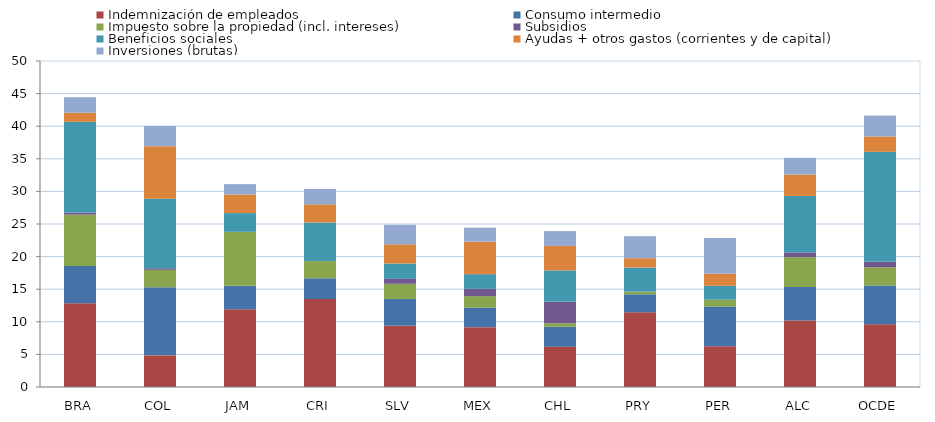
| Category | Indemnización de empleados | Consumo intermedio | Impuesto sobre la propiedad (incl. intereses) | Subsidios | Beneficios sociales | Ayudas + otros gastos (corrientes y de capital) | Inversiones (brutas) |
|---|---|---|---|---|---|---|---|
| BRA | 12.853 | 5.708 | 7.864 | 0.342 | 13.909 | 1.388 | 2.387 |
| COL | 4.854 | 10.453 | 2.661 | 0.248 | 10.652 | 8.074 | 3.1 |
| JAM | 11.924 | 3.609 | 8.269 | 0 | 2.869 | 2.862 | 1.579 |
| CRI | 13.495 | 3.185 | 2.637 | 0 | 5.919 | 2.775 | 2.374 |
| SLV | 9.402 | 4.103 | 2.321 | 0.757 | 2.356 | 2.942 | 2.986 |
| MEX | 9.18 | 2.974 | 1.783 | 1.112 | 2.262 | 4.979 | 2.148 |
| CHL | 6.165 | 3.057 | 0.549 | 3.313 | 4.798 | 3.76 | 2.266 |
| PRY | 11.457 | 2.765 | 0.39 | 0.033 | 3.674 | 1.439 | 3.37 |
| PER | 6.241 | 6.097 | 1.052 | 0 | 2.126 | 1.848 | 5.499 |
| ALC | 10.211 | 5.129 | 4.583 | 0.72 | 8.661 | 3.287 | 2.556 |
| OCDE | 9.607 | 5.947 | 2.811 | 0.84 | 16.861 | 2.361 | 3.207 |